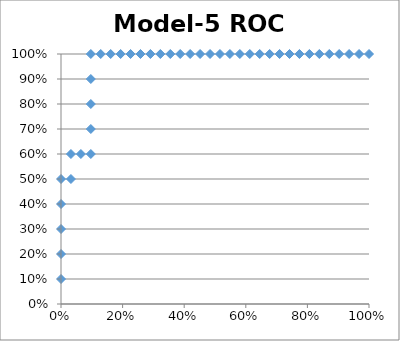
| Category | TPR |
|---|---|
| 0.0 | 0.1 |
| 0.0 | 0.2 |
| 0.0 | 0.3 |
| 0.0 | 0.4 |
| 0.0 | 0.5 |
| 0.03225806451612903 | 0.5 |
| 0.03225806451612903 | 0.6 |
| 0.06451612903225806 | 0.6 |
| 0.0967741935483871 | 0.6 |
| 0.0967741935483871 | 0.7 |
| 0.0967741935483871 | 0.8 |
| 0.0967741935483871 | 0.9 |
| 0.0967741935483871 | 1 |
| 0.12903225806451613 | 1 |
| 0.16129032258064516 | 1 |
| 0.1935483870967742 | 1 |
| 0.22580645161290322 | 1 |
| 0.25806451612903225 | 1 |
| 0.2903225806451613 | 1 |
| 0.3225806451612903 | 1 |
| 0.3548387096774194 | 1 |
| 0.3870967741935484 | 1 |
| 0.41935483870967744 | 1 |
| 0.45161290322580644 | 1 |
| 0.4838709677419355 | 1 |
| 0.5161290322580645 | 1 |
| 0.5483870967741935 | 1 |
| 0.5806451612903226 | 1 |
| 0.6129032258064516 | 1 |
| 0.6451612903225806 | 1 |
| 0.6774193548387096 | 1 |
| 0.7096774193548387 | 1 |
| 0.7419354838709677 | 1 |
| 0.7741935483870968 | 1 |
| 0.8064516129032258 | 1 |
| 0.8387096774193549 | 1 |
| 0.8709677419354839 | 1 |
| 0.9032258064516129 | 1 |
| 0.9354838709677419 | 1 |
| 0.967741935483871 | 1 |
| 1.0 | 1 |